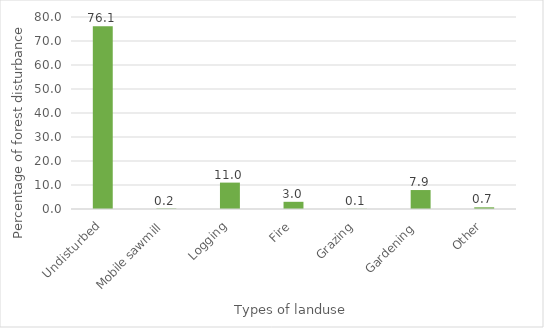
| Category | Percent |
|---|---|
| Undisturbed | 76.1 |
| Mobile sawmill | 0.2 |
| Logging | 11 |
| Fire | 3 |
| Grazing | 0.1 |
| Gardening  | 7.9 |
| Other | 0.7 |